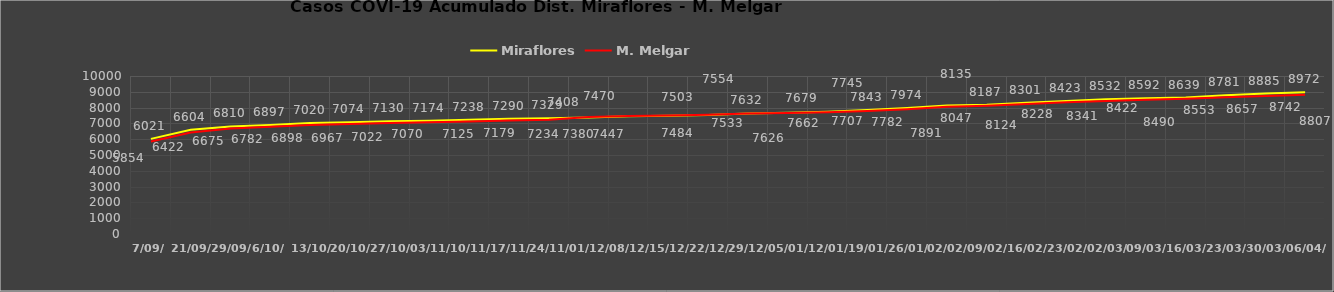
| Category | Miraflores | M. Melgar |
|---|---|---|
| 7/09/ | 6021 | 5854 |
| 21/09/ | 6604 | 6422 |
| 29/09/ | 6810 | 6675 |
| 6/10/ | 6897 | 6782 |
| 13/10/ | 7020 | 6898 |
| 20/10/ | 7074 | 6967 |
| 27/10/ | 7130 | 7022 |
| 03/11/ | 7174 | 7070 |
| 10/11/ | 7238 | 7125 |
| 17/11/ | 7290 | 7179 |
| 24/11/ | 7329 | 7234 |
| 01/12/ | 7380 | 7408 |
| 08/12/ | 7447 | 7470 |
| 15/12/ | 7484 | 7503 |
| 22/12/ | 7533 | 7554 |
| 29/12/ | 7632 | 7626 |
| 05/01/ | 7679 | 7662 |
| 12/01/ | 7745 | 7707 |
| 19/01/ | 7843 | 7782 |
| 26/01/ | 7974 | 7891 |
| 02/02/ | 8135 | 8047 |
| 09/02/ | 8187 | 8124 |
| 16/02/ | 8301 | 8228 |
| 23/02/ | 8423 | 8341 |
| 02/03/ | 8532 | 8422 |
| 09/03/ | 8592 | 8490 |
| 16/03/ | 8639 | 8553 |
| 23/03/ | 8781 | 8657 |
| 30/03/ | 8885 | 8742 |
| 06/04/ | 8972 | 8807 |